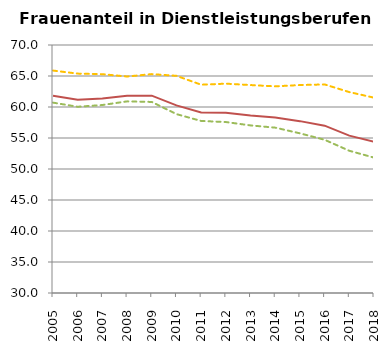
| Category | Series 1 | Series 2 | Series 3 |
|---|---|---|---|
| 2005 | 61.829 | 60.706 | 65.877 |
| 2006 | 61.18 | 60.041 | 65.386 |
| 2007 | 61.376 | 60.319 | 65.294 |
| 2008 | 61.8 | 60.908 | 64.917 |
| 2009 | 61.83 | 60.816 | 65.305 |
| 2010 | 60.258 | 58.853 | 65.029 |
| 2011 | 59.114 | 57.749 | 63.595 |
| 2012 | 59.064 | 57.574 | 63.764 |
| 2013 | 58.624 | 57.032 | 63.54 |
| 2014 | 58.32 | 56.67 | 63.333 |
| 2015 | 57.719 | 55.754 | 63.539 |
| 2016 | 56.992 | 54.713 | 63.64 |
| 2017 | 55.381 | 52.941 | 62.406 |
| 2018 | 54.402 | 51.837 | 61.506 |